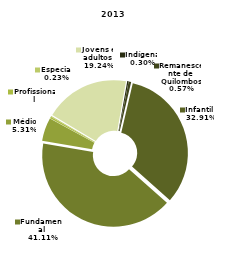
| Category | 2013 |
|---|---|
| Indígena | 20 |
| Remanescente de Quilombos | 38 |
| Infantil  | 2181 |
| Fundamental | 2725 |
| Médio | 352 |
| Profissional | 22 |
| Especial | 15 |
| Jovens e adultos | 1275 |